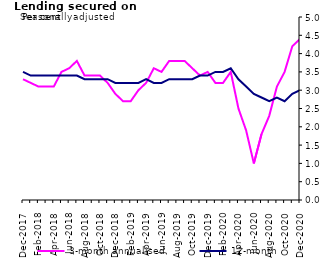
| Category | 3-month annualised | 12-month |
|---|---|---|
| Dec-2017 | 3.3 | 3.5 |
| Jan-2018 | 3.2 | 3.4 |
| Feb-2018 | 3.1 | 3.4 |
| Mar-2018 | 3.1 | 3.4 |
| Apr-2018 | 3.1 | 3.4 |
| May-2018 | 3.5 | 3.4 |
| Jun-2018 | 3.6 | 3.4 |
| Jul-2018 | 3.8 | 3.4 |
| Aug-2018 | 3.4 | 3.3 |
| Sep-2018 | 3.4 | 3.3 |
| Oct-2018 | 3.4 | 3.3 |
| Nov-2018 | 3.2 | 3.3 |
| Dec-2018 | 2.9 | 3.2 |
| Jan-2019 | 2.7 | 3.2 |
| Feb-2019 | 2.7 | 3.2 |
| Mar-2019 | 3 | 3.2 |
| Apr-2019 | 3.2 | 3.3 |
| May-2019 | 3.6 | 3.2 |
| Jun-2019 | 3.5 | 3.2 |
| Jul-2019 | 3.8 | 3.3 |
| Aug-2019 | 3.8 | 3.3 |
| Sep-2019 | 3.8 | 3.3 |
| Oct-2019 | 3.6 | 3.3 |
| Nov-2019 | 3.4 | 3.4 |
| Dec-2019 | 3.5 | 3.4 |
| Jan-2020 | 3.2 | 3.5 |
| Feb-2020 | 3.2 | 3.5 |
| Mar-2020 | 3.5 | 3.6 |
| Apr-2020 | 2.5 | 3.3 |
| May-2020 | 1.9 | 3.1 |
| Jun-2020 | 1 | 2.9 |
| Jul-2020 | 1.8 | 2.8 |
| Aug-2020 | 2.3 | 2.7 |
| Sep-2020 | 3.1 | 2.8 |
| Oct-2020 | 3.5 | 2.7 |
| Nov-2020 | 4.2 | 2.9 |
| Dec-2020 | 4.4 | 3 |